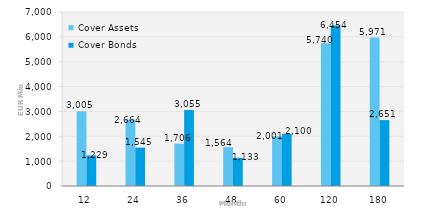
| Category | Cover Assets | Cover Bonds |
|---|---|---|
| 12.0 | 3004.611 | 1228.928 |
| 24.0 | 2664.38 | 1544.956 |
| 36.0 | 1706.17 | 3054.543 |
| 48.0 | 1564.49 | 1133.343 |
| 60.0 | 2000.715 | 2100.132 |
| 120.0 | 5740.148 | 6454.055 |
| 180.0 | 5970.637 | 2651.301 |